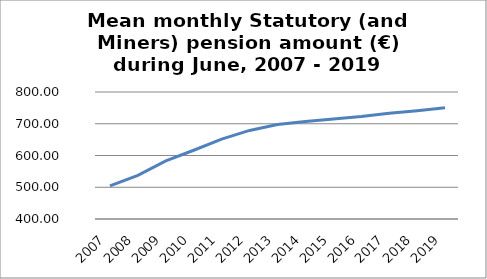
| Category | Series 0 |
|---|---|
| 2007.0 | 504.426 |
| 2008.0 | 537.591 |
| 2009.0 | 582.94 |
| 2010.0 | 616.567 |
| 2011.0 | 651.509 |
| 2012.0 | 678.951 |
| 2013.0 | 697.458 |
| 2014.0 | 707.063 |
| 2015.0 | 715.126 |
| 2016.0 | 722.83 |
| 2017.0 | 732.9 |
| 2018.0 | 740.61 |
| 2019.0 | 750.15 |